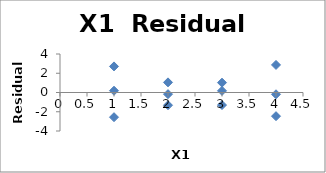
| Category | Series 0 |
|---|---|
| 1.0 | 2.71 |
| 2.0 | 1.053 |
| 3.0 | -1.303 |
| 4.0 | -2.46 |
| 1.0 | 0.185 |
| 2.0 | -0.172 |
| 3.0 | 0.172 |
| 4.0 | -0.185 |
| 1.0 | -2.565 |
| 2.0 | -1.322 |
| 3.0 | 1.022 |
| 4.0 | 2.865 |